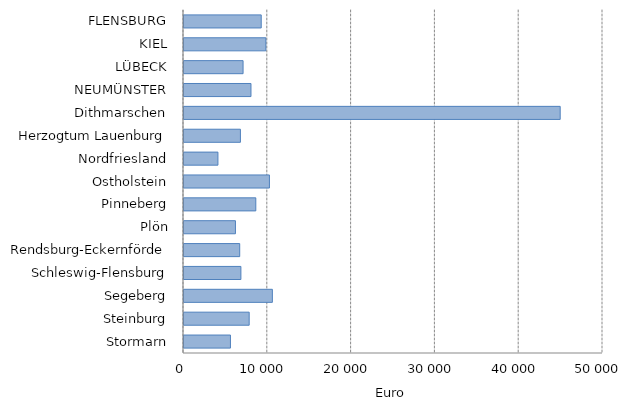
| Category | Euro |
|---|---|
| Stormarn | 5543.125 |
| Steinburg | 7777.264 |
| Segeberg | 10544.315 |
| Schleswig-Flensburg | 6790.473 |
| Rendsburg-Eckernförde | 6648.288 |
| Plön | 6139.526 |
| Pinneberg | 8569.354 |
| Ostholstein | 10193.676 |
| Nordfriesland | 4048.128 |
| Herzogtum Lauenburg | 6732.518 |
| Dithmarschen | 44891.456 |
| NEUMÜNSTER | 7993.302 |
| LÜBECK | 7049.841 |
| KIEL | 9767.988 |
| FLENSBURG | 9215.331 |